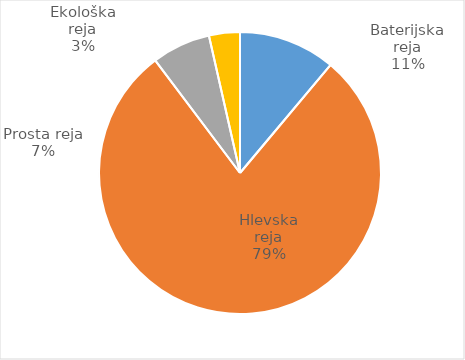
| Category | Število kosov jajc |
|---|---|
| Baterijska reja | 314399 |
| Hlevska reja | 2226015 |
| Prosta reja | 190403 |
| Ekološka reja | 100280 |